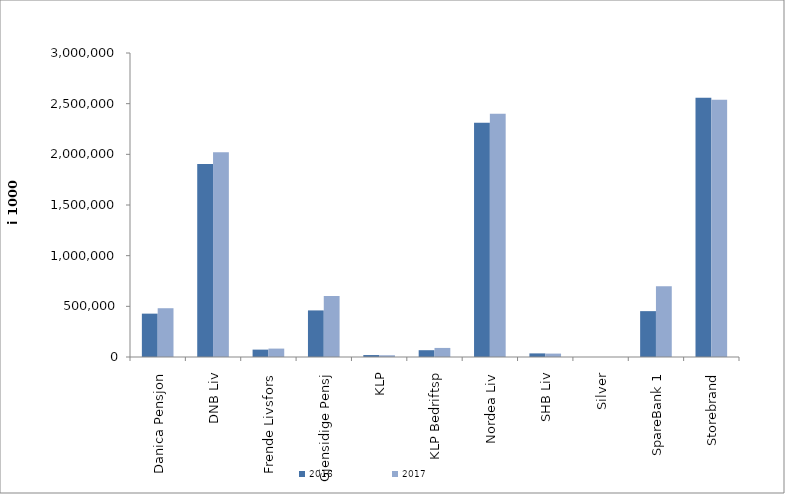
| Category | 2016 | 2017 |
|---|---|---|
| 0 | 427878.547 | 481311.815 |
| 1 | 1903608 | 2020493 |
| 2 | 72809 | 83001 |
| 3 | 459736.743 | 601986 |
| 4 | 19254.72 | 17027.863 |
| 5 | 67086 | 89510 |
| 6 | 2311573.67 | 2401470.457 |
| 7 | 35581 | 33664 |
| 8 | 0 | 0 |
| 9 | 452574.882 | 697464.444 |
| 10 | 2557556.949 | 2537946.216 |